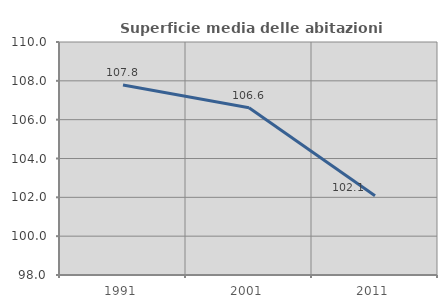
| Category | Superficie media delle abitazioni occupate |
|---|---|
| 1991.0 | 107.781 |
| 2001.0 | 106.615 |
| 2011.0 | 102.085 |